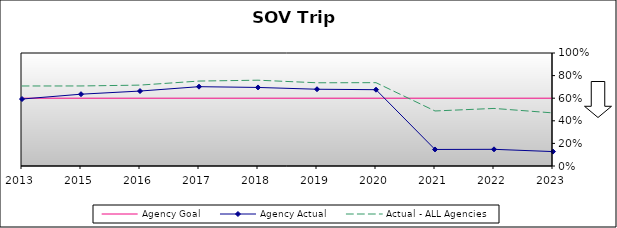
| Category | Agency Goal | Agency Actual | Actual - ALL Agencies |
|---|---|---|---|
| 2013.0 | 0.6 | 0.593 | 0.708 |
| 2015.0 | 0.6 | 0.635 | 0.708 |
| 2016.0 | 0.6 | 0.663 | 0.716 |
| 2017.0 | 0.6 | 0.702 | 0.752 |
| 2018.0 | 0.6 | 0.695 | 0.759 |
| 2019.0 | 0.6 | 0.679 | 0.736 |
| 2020.0 | 0.6 | 0.675 | 0.737 |
| 2021.0 | 0.6 | 0.146 | 0.487 |
| 2022.0 | 0.6 | 0.148 | 0.509 |
| 2023.0 | 0.6 | 0.128 | 0.47 |